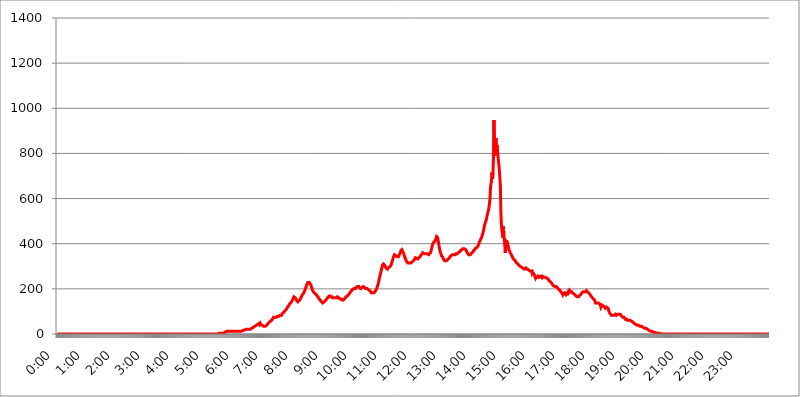
| Category | 2015.05.31. Intenzitás [W/m^2] |
|---|---|
| 0.0 | 0 |
| 0.0006944444444444445 | 0 |
| 0.001388888888888889 | 0 |
| 0.0020833333333333333 | 0 |
| 0.002777777777777778 | 0 |
| 0.003472222222222222 | 0 |
| 0.004166666666666667 | 0 |
| 0.004861111111111111 | 0 |
| 0.005555555555555556 | 0 |
| 0.0062499999999999995 | 0 |
| 0.006944444444444444 | 0 |
| 0.007638888888888889 | 0 |
| 0.008333333333333333 | 0 |
| 0.009027777777777779 | 0 |
| 0.009722222222222222 | 0 |
| 0.010416666666666666 | 0 |
| 0.011111111111111112 | 0 |
| 0.011805555555555555 | 0 |
| 0.012499999999999999 | 0 |
| 0.013194444444444444 | 0 |
| 0.013888888888888888 | 0 |
| 0.014583333333333332 | 0 |
| 0.015277777777777777 | 0 |
| 0.015972222222222224 | 0 |
| 0.016666666666666666 | 0 |
| 0.017361111111111112 | 0 |
| 0.018055555555555557 | 0 |
| 0.01875 | 0 |
| 0.019444444444444445 | 0 |
| 0.02013888888888889 | 0 |
| 0.020833333333333332 | 0 |
| 0.02152777777777778 | 0 |
| 0.022222222222222223 | 0 |
| 0.02291666666666667 | 0 |
| 0.02361111111111111 | 0 |
| 0.024305555555555556 | 0 |
| 0.024999999999999998 | 0 |
| 0.025694444444444447 | 0 |
| 0.02638888888888889 | 0 |
| 0.027083333333333334 | 0 |
| 0.027777777777777776 | 0 |
| 0.02847222222222222 | 0 |
| 0.029166666666666664 | 0 |
| 0.029861111111111113 | 0 |
| 0.030555555555555555 | 0 |
| 0.03125 | 0 |
| 0.03194444444444445 | 0 |
| 0.03263888888888889 | 0 |
| 0.03333333333333333 | 0 |
| 0.034027777777777775 | 0 |
| 0.034722222222222224 | 0 |
| 0.035416666666666666 | 0 |
| 0.036111111111111115 | 0 |
| 0.03680555555555556 | 0 |
| 0.0375 | 0 |
| 0.03819444444444444 | 0 |
| 0.03888888888888889 | 0 |
| 0.03958333333333333 | 0 |
| 0.04027777777777778 | 0 |
| 0.04097222222222222 | 0 |
| 0.041666666666666664 | 0 |
| 0.042361111111111106 | 0 |
| 0.04305555555555556 | 0 |
| 0.043750000000000004 | 0 |
| 0.044444444444444446 | 0 |
| 0.04513888888888889 | 0 |
| 0.04583333333333334 | 0 |
| 0.04652777777777778 | 0 |
| 0.04722222222222222 | 0 |
| 0.04791666666666666 | 0 |
| 0.04861111111111111 | 0 |
| 0.049305555555555554 | 0 |
| 0.049999999999999996 | 0 |
| 0.05069444444444445 | 0 |
| 0.051388888888888894 | 0 |
| 0.052083333333333336 | 0 |
| 0.05277777777777778 | 0 |
| 0.05347222222222222 | 0 |
| 0.05416666666666667 | 0 |
| 0.05486111111111111 | 0 |
| 0.05555555555555555 | 0 |
| 0.05625 | 0 |
| 0.05694444444444444 | 0 |
| 0.057638888888888885 | 0 |
| 0.05833333333333333 | 0 |
| 0.05902777777777778 | 0 |
| 0.059722222222222225 | 0 |
| 0.06041666666666667 | 0 |
| 0.061111111111111116 | 0 |
| 0.06180555555555556 | 0 |
| 0.0625 | 0 |
| 0.06319444444444444 | 0 |
| 0.06388888888888888 | 0 |
| 0.06458333333333334 | 0 |
| 0.06527777777777778 | 0 |
| 0.06597222222222222 | 0 |
| 0.06666666666666667 | 0 |
| 0.06736111111111111 | 0 |
| 0.06805555555555555 | 0 |
| 0.06874999999999999 | 0 |
| 0.06944444444444443 | 0 |
| 0.07013888888888889 | 0 |
| 0.07083333333333333 | 0 |
| 0.07152777777777779 | 0 |
| 0.07222222222222223 | 0 |
| 0.07291666666666667 | 0 |
| 0.07361111111111111 | 0 |
| 0.07430555555555556 | 0 |
| 0.075 | 0 |
| 0.07569444444444444 | 0 |
| 0.0763888888888889 | 0 |
| 0.07708333333333334 | 0 |
| 0.07777777777777778 | 0 |
| 0.07847222222222222 | 0 |
| 0.07916666666666666 | 0 |
| 0.0798611111111111 | 0 |
| 0.08055555555555556 | 0 |
| 0.08125 | 0 |
| 0.08194444444444444 | 0 |
| 0.08263888888888889 | 0 |
| 0.08333333333333333 | 0 |
| 0.08402777777777777 | 0 |
| 0.08472222222222221 | 0 |
| 0.08541666666666665 | 0 |
| 0.08611111111111112 | 0 |
| 0.08680555555555557 | 0 |
| 0.08750000000000001 | 0 |
| 0.08819444444444445 | 0 |
| 0.08888888888888889 | 0 |
| 0.08958333333333333 | 0 |
| 0.09027777777777778 | 0 |
| 0.09097222222222222 | 0 |
| 0.09166666666666667 | 0 |
| 0.09236111111111112 | 0 |
| 0.09305555555555556 | 0 |
| 0.09375 | 0 |
| 0.09444444444444444 | 0 |
| 0.09513888888888888 | 0 |
| 0.09583333333333333 | 0 |
| 0.09652777777777777 | 0 |
| 0.09722222222222222 | 0 |
| 0.09791666666666667 | 0 |
| 0.09861111111111111 | 0 |
| 0.09930555555555555 | 0 |
| 0.09999999999999999 | 0 |
| 0.10069444444444443 | 0 |
| 0.1013888888888889 | 0 |
| 0.10208333333333335 | 0 |
| 0.10277777777777779 | 0 |
| 0.10347222222222223 | 0 |
| 0.10416666666666667 | 0 |
| 0.10486111111111111 | 0 |
| 0.10555555555555556 | 0 |
| 0.10625 | 0 |
| 0.10694444444444444 | 0 |
| 0.1076388888888889 | 0 |
| 0.10833333333333334 | 0 |
| 0.10902777777777778 | 0 |
| 0.10972222222222222 | 0 |
| 0.1111111111111111 | 0 |
| 0.11180555555555556 | 0 |
| 0.11180555555555556 | 0 |
| 0.1125 | 0 |
| 0.11319444444444444 | 0 |
| 0.11388888888888889 | 0 |
| 0.11458333333333333 | 0 |
| 0.11527777777777777 | 0 |
| 0.11597222222222221 | 0 |
| 0.11666666666666665 | 0 |
| 0.1173611111111111 | 0 |
| 0.11805555555555557 | 0 |
| 0.11944444444444445 | 0 |
| 0.12013888888888889 | 0 |
| 0.12083333333333333 | 0 |
| 0.12152777777777778 | 0 |
| 0.12222222222222223 | 0 |
| 0.12291666666666667 | 0 |
| 0.12291666666666667 | 0 |
| 0.12361111111111112 | 0 |
| 0.12430555555555556 | 0 |
| 0.125 | 0 |
| 0.12569444444444444 | 0 |
| 0.12638888888888888 | 0 |
| 0.12708333333333333 | 0 |
| 0.16875 | 0 |
| 0.12847222222222224 | 0 |
| 0.12916666666666668 | 0 |
| 0.12986111111111112 | 0 |
| 0.13055555555555556 | 0 |
| 0.13125 | 0 |
| 0.13194444444444445 | 0 |
| 0.1326388888888889 | 0 |
| 0.13333333333333333 | 0 |
| 0.13402777777777777 | 0 |
| 0.13402777777777777 | 0 |
| 0.13472222222222222 | 0 |
| 0.13541666666666666 | 0 |
| 0.1361111111111111 | 0 |
| 0.13749999999999998 | 0 |
| 0.13819444444444443 | 0 |
| 0.1388888888888889 | 0 |
| 0.13958333333333334 | 0 |
| 0.14027777777777778 | 0 |
| 0.14097222222222222 | 0 |
| 0.14166666666666666 | 0 |
| 0.1423611111111111 | 0 |
| 0.14305555555555557 | 0 |
| 0.14375000000000002 | 0 |
| 0.14444444444444446 | 0 |
| 0.1451388888888889 | 0 |
| 0.1451388888888889 | 0 |
| 0.14652777777777778 | 0 |
| 0.14722222222222223 | 0 |
| 0.14791666666666667 | 0 |
| 0.1486111111111111 | 0 |
| 0.14930555555555555 | 0 |
| 0.15 | 0 |
| 0.15069444444444444 | 0 |
| 0.15138888888888888 | 0 |
| 0.15208333333333332 | 0 |
| 0.15277777777777776 | 0 |
| 0.15347222222222223 | 0 |
| 0.15416666666666667 | 0 |
| 0.15486111111111112 | 0 |
| 0.15555555555555556 | 0 |
| 0.15625 | 0 |
| 0.15694444444444444 | 0 |
| 0.15763888888888888 | 0 |
| 0.15833333333333333 | 0 |
| 0.15902777777777777 | 0 |
| 0.15972222222222224 | 0 |
| 0.16041666666666668 | 0 |
| 0.16111111111111112 | 0 |
| 0.16180555555555556 | 0 |
| 0.1625 | 0 |
| 0.16319444444444445 | 0 |
| 0.1638888888888889 | 0 |
| 0.16458333333333333 | 0 |
| 0.16527777777777777 | 0 |
| 0.16597222222222222 | 0 |
| 0.16666666666666666 | 0 |
| 0.1673611111111111 | 0 |
| 0.16805555555555554 | 0 |
| 0.16874999999999998 | 0 |
| 0.16944444444444443 | 0 |
| 0.17013888888888887 | 0 |
| 0.1708333333333333 | 0 |
| 0.17152777777777775 | 0 |
| 0.17222222222222225 | 0 |
| 0.1729166666666667 | 0 |
| 0.17361111111111113 | 0 |
| 0.17430555555555557 | 0 |
| 0.17500000000000002 | 0 |
| 0.17569444444444446 | 0 |
| 0.1763888888888889 | 0 |
| 0.17708333333333334 | 0 |
| 0.17777777777777778 | 0 |
| 0.17847222222222223 | 0 |
| 0.17916666666666667 | 0 |
| 0.1798611111111111 | 0 |
| 0.18055555555555555 | 0 |
| 0.18125 | 0 |
| 0.18194444444444444 | 0 |
| 0.1826388888888889 | 0 |
| 0.18333333333333335 | 0 |
| 0.1840277777777778 | 0 |
| 0.18472222222222223 | 0 |
| 0.18541666666666667 | 0 |
| 0.18611111111111112 | 0 |
| 0.18680555555555556 | 0 |
| 0.1875 | 0 |
| 0.18819444444444444 | 0 |
| 0.18888888888888888 | 0 |
| 0.18958333333333333 | 0 |
| 0.19027777777777777 | 0 |
| 0.1909722222222222 | 0 |
| 0.19166666666666665 | 0 |
| 0.19236111111111112 | 0 |
| 0.19305555555555554 | 0 |
| 0.19375 | 0 |
| 0.19444444444444445 | 0 |
| 0.1951388888888889 | 0 |
| 0.19583333333333333 | 0 |
| 0.19652777777777777 | 0 |
| 0.19722222222222222 | 0 |
| 0.19791666666666666 | 0 |
| 0.1986111111111111 | 0 |
| 0.19930555555555554 | 0 |
| 0.19999999999999998 | 0 |
| 0.20069444444444443 | 0 |
| 0.20138888888888887 | 0 |
| 0.2020833333333333 | 0 |
| 0.2027777777777778 | 0 |
| 0.2034722222222222 | 0 |
| 0.2041666666666667 | 0 |
| 0.20486111111111113 | 0 |
| 0.20555555555555557 | 0 |
| 0.20625000000000002 | 0 |
| 0.20694444444444446 | 0 |
| 0.2076388888888889 | 0 |
| 0.20833333333333334 | 0 |
| 0.20902777777777778 | 0 |
| 0.20972222222222223 | 0 |
| 0.21041666666666667 | 0 |
| 0.2111111111111111 | 0 |
| 0.21180555555555555 | 0 |
| 0.2125 | 0 |
| 0.21319444444444444 | 0 |
| 0.2138888888888889 | 0 |
| 0.21458333333333335 | 0 |
| 0.2152777777777778 | 0 |
| 0.21597222222222223 | 0 |
| 0.21666666666666667 | 0 |
| 0.21736111111111112 | 0 |
| 0.21805555555555556 | 0 |
| 0.21875 | 0 |
| 0.21944444444444444 | 0 |
| 0.22013888888888888 | 0 |
| 0.22083333333333333 | 0 |
| 0.22152777777777777 | 0 |
| 0.2222222222222222 | 0 |
| 0.22291666666666665 | 0 |
| 0.2236111111111111 | 0 |
| 0.22430555555555556 | 0 |
| 0.225 | 0 |
| 0.22569444444444445 | 3.525 |
| 0.2263888888888889 | 3.525 |
| 0.22708333333333333 | 3.525 |
| 0.22777777777777777 | 3.525 |
| 0.22847222222222222 | 3.525 |
| 0.22916666666666666 | 3.525 |
| 0.2298611111111111 | 3.525 |
| 0.23055555555555554 | 3.525 |
| 0.23124999999999998 | 3.525 |
| 0.23194444444444443 | 3.525 |
| 0.23263888888888887 | 3.525 |
| 0.2333333333333333 | 3.525 |
| 0.2340277777777778 | 3.525 |
| 0.2347222222222222 | 7.887 |
| 0.2354166666666667 | 7.887 |
| 0.23611111111111113 | 7.887 |
| 0.23680555555555557 | 7.887 |
| 0.23750000000000002 | 12.257 |
| 0.23819444444444446 | 12.257 |
| 0.2388888888888889 | 7.887 |
| 0.23958333333333334 | 12.257 |
| 0.24027777777777778 | 12.257 |
| 0.24097222222222223 | 12.257 |
| 0.24166666666666667 | 12.257 |
| 0.2423611111111111 | 12.257 |
| 0.24305555555555555 | 12.257 |
| 0.24375 | 12.257 |
| 0.24444444444444446 | 12.257 |
| 0.24513888888888888 | 12.257 |
| 0.24583333333333335 | 12.257 |
| 0.2465277777777778 | 12.257 |
| 0.24722222222222223 | 12.257 |
| 0.24791666666666667 | 12.257 |
| 0.24861111111111112 | 12.257 |
| 0.24930555555555556 | 12.257 |
| 0.25 | 12.257 |
| 0.25069444444444444 | 12.257 |
| 0.2513888888888889 | 12.257 |
| 0.2520833333333333 | 12.257 |
| 0.25277777777777777 | 12.257 |
| 0.2534722222222222 | 12.257 |
| 0.25416666666666665 | 12.257 |
| 0.2548611111111111 | 12.257 |
| 0.2555555555555556 | 12.257 |
| 0.25625000000000003 | 12.257 |
| 0.2569444444444445 | 12.257 |
| 0.2576388888888889 | 12.257 |
| 0.25833333333333336 | 12.257 |
| 0.2590277777777778 | 12.257 |
| 0.25972222222222224 | 16.636 |
| 0.2604166666666667 | 16.636 |
| 0.2611111111111111 | 16.636 |
| 0.26180555555555557 | 16.636 |
| 0.2625 | 16.636 |
| 0.26319444444444445 | 21.024 |
| 0.2638888888888889 | 21.024 |
| 0.26458333333333334 | 21.024 |
| 0.2652777777777778 | 21.024 |
| 0.2659722222222222 | 21.024 |
| 0.26666666666666666 | 21.024 |
| 0.2673611111111111 | 21.024 |
| 0.26805555555555555 | 21.024 |
| 0.26875 | 21.024 |
| 0.26944444444444443 | 21.024 |
| 0.2701388888888889 | 21.024 |
| 0.2708333333333333 | 21.024 |
| 0.27152777777777776 | 25.419 |
| 0.2722222222222222 | 25.419 |
| 0.27291666666666664 | 25.419 |
| 0.2736111111111111 | 25.419 |
| 0.2743055555555555 | 29.823 |
| 0.27499999999999997 | 29.823 |
| 0.27569444444444446 | 29.823 |
| 0.27638888888888885 | 29.823 |
| 0.27708333333333335 | 34.234 |
| 0.2777777777777778 | 34.234 |
| 0.27847222222222223 | 38.653 |
| 0.2791666666666667 | 38.653 |
| 0.2798611111111111 | 38.653 |
| 0.28055555555555556 | 43.079 |
| 0.28125 | 43.079 |
| 0.28194444444444444 | 43.079 |
| 0.2826388888888889 | 43.079 |
| 0.2833333333333333 | 47.511 |
| 0.28402777777777777 | 43.079 |
| 0.2847222222222222 | 47.511 |
| 0.28541666666666665 | 43.079 |
| 0.28611111111111115 | 43.079 |
| 0.28680555555555554 | 43.079 |
| 0.28750000000000003 | 38.653 |
| 0.2881944444444445 | 38.653 |
| 0.2888888888888889 | 38.653 |
| 0.28958333333333336 | 34.234 |
| 0.2902777777777778 | 34.234 |
| 0.29097222222222224 | 34.234 |
| 0.2916666666666667 | 34.234 |
| 0.2923611111111111 | 34.234 |
| 0.29305555555555557 | 34.234 |
| 0.29375 | 38.653 |
| 0.29444444444444445 | 38.653 |
| 0.2951388888888889 | 43.079 |
| 0.29583333333333334 | 47.511 |
| 0.2965277777777778 | 47.511 |
| 0.2972222222222222 | 51.951 |
| 0.29791666666666666 | 51.951 |
| 0.2986111111111111 | 56.398 |
| 0.29930555555555555 | 56.398 |
| 0.3 | 56.398 |
| 0.30069444444444443 | 60.85 |
| 0.3013888888888889 | 65.31 |
| 0.3020833333333333 | 65.31 |
| 0.30277777777777776 | 69.775 |
| 0.3034722222222222 | 74.246 |
| 0.30416666666666664 | 74.246 |
| 0.3048611111111111 | 74.246 |
| 0.3055555555555555 | 74.246 |
| 0.30624999999999997 | 74.246 |
| 0.3069444444444444 | 74.246 |
| 0.3076388888888889 | 74.246 |
| 0.30833333333333335 | 74.246 |
| 0.3090277777777778 | 78.722 |
| 0.30972222222222223 | 78.722 |
| 0.3104166666666667 | 78.722 |
| 0.3111111111111111 | 78.722 |
| 0.31180555555555556 | 78.722 |
| 0.3125 | 83.205 |
| 0.31319444444444444 | 83.205 |
| 0.3138888888888889 | 83.205 |
| 0.3145833333333333 | 83.205 |
| 0.31527777777777777 | 87.692 |
| 0.3159722222222222 | 92.184 |
| 0.31666666666666665 | 92.184 |
| 0.31736111111111115 | 92.184 |
| 0.31805555555555554 | 96.682 |
| 0.31875000000000003 | 101.184 |
| 0.3194444444444445 | 101.184 |
| 0.3201388888888889 | 105.69 |
| 0.32083333333333336 | 105.69 |
| 0.3215277777777778 | 110.201 |
| 0.32222222222222224 | 114.716 |
| 0.3229166666666667 | 119.235 |
| 0.3236111111111111 | 119.235 |
| 0.32430555555555557 | 123.758 |
| 0.325 | 128.284 |
| 0.32569444444444445 | 132.814 |
| 0.3263888888888889 | 132.814 |
| 0.32708333333333334 | 137.347 |
| 0.3277777777777778 | 137.347 |
| 0.3284722222222222 | 141.884 |
| 0.32916666666666666 | 146.423 |
| 0.3298611111111111 | 150.964 |
| 0.33055555555555555 | 155.509 |
| 0.33125 | 160.056 |
| 0.33194444444444443 | 164.605 |
| 0.3326388888888889 | 164.605 |
| 0.3333333333333333 | 164.605 |
| 0.3340277777777778 | 160.056 |
| 0.3347222222222222 | 155.509 |
| 0.3354166666666667 | 150.964 |
| 0.3361111111111111 | 146.423 |
| 0.3368055555555556 | 146.423 |
| 0.33749999999999997 | 141.884 |
| 0.33819444444444446 | 141.884 |
| 0.33888888888888885 | 146.423 |
| 0.33958333333333335 | 146.423 |
| 0.34027777777777773 | 150.964 |
| 0.34097222222222223 | 155.509 |
| 0.3416666666666666 | 160.056 |
| 0.3423611111111111 | 164.605 |
| 0.3430555555555555 | 169.156 |
| 0.34375 | 173.709 |
| 0.3444444444444445 | 173.709 |
| 0.3451388888888889 | 178.264 |
| 0.3458333333333334 | 182.82 |
| 0.34652777777777777 | 187.378 |
| 0.34722222222222227 | 191.937 |
| 0.34791666666666665 | 201.058 |
| 0.34861111111111115 | 205.62 |
| 0.34930555555555554 | 210.182 |
| 0.35000000000000003 | 219.309 |
| 0.3506944444444444 | 223.873 |
| 0.3513888888888889 | 228.436 |
| 0.3520833333333333 | 228.436 |
| 0.3527777777777778 | 228.436 |
| 0.3534722222222222 | 228.436 |
| 0.3541666666666667 | 223.873 |
| 0.3548611111111111 | 223.873 |
| 0.35555555555555557 | 219.309 |
| 0.35625 | 210.182 |
| 0.35694444444444445 | 205.62 |
| 0.3576388888888889 | 196.497 |
| 0.35833333333333334 | 191.937 |
| 0.3590277777777778 | 187.378 |
| 0.3597222222222222 | 187.378 |
| 0.36041666666666666 | 182.82 |
| 0.3611111111111111 | 182.82 |
| 0.36180555555555555 | 178.264 |
| 0.3625 | 178.264 |
| 0.36319444444444443 | 173.709 |
| 0.3638888888888889 | 173.709 |
| 0.3645833333333333 | 169.156 |
| 0.3652777777777778 | 164.605 |
| 0.3659722222222222 | 164.605 |
| 0.3666666666666667 | 160.056 |
| 0.3673611111111111 | 155.509 |
| 0.3680555555555556 | 155.509 |
| 0.36874999999999997 | 150.964 |
| 0.36944444444444446 | 146.423 |
| 0.37013888888888885 | 146.423 |
| 0.37083333333333335 | 141.884 |
| 0.37152777777777773 | 141.884 |
| 0.37222222222222223 | 137.347 |
| 0.3729166666666666 | 137.347 |
| 0.3736111111111111 | 137.347 |
| 0.3743055555555555 | 141.884 |
| 0.375 | 141.884 |
| 0.3756944444444445 | 146.423 |
| 0.3763888888888889 | 146.423 |
| 0.3770833333333334 | 150.964 |
| 0.37777777777777777 | 155.509 |
| 0.37847222222222227 | 155.509 |
| 0.37916666666666665 | 160.056 |
| 0.37986111111111115 | 164.605 |
| 0.38055555555555554 | 164.605 |
| 0.38125000000000003 | 164.605 |
| 0.3819444444444444 | 169.156 |
| 0.3826388888888889 | 169.156 |
| 0.3833333333333333 | 164.605 |
| 0.3840277777777778 | 164.605 |
| 0.3847222222222222 | 164.605 |
| 0.3854166666666667 | 164.605 |
| 0.3861111111111111 | 160.056 |
| 0.38680555555555557 | 160.056 |
| 0.3875 | 160.056 |
| 0.38819444444444445 | 160.056 |
| 0.3888888888888889 | 160.056 |
| 0.38958333333333334 | 160.056 |
| 0.3902777777777778 | 160.056 |
| 0.3909722222222222 | 160.056 |
| 0.39166666666666666 | 160.056 |
| 0.3923611111111111 | 160.056 |
| 0.39305555555555555 | 164.605 |
| 0.39375 | 164.605 |
| 0.39444444444444443 | 164.605 |
| 0.3951388888888889 | 160.056 |
| 0.3958333333333333 | 160.056 |
| 0.3965277777777778 | 155.509 |
| 0.3972222222222222 | 155.509 |
| 0.3979166666666667 | 155.509 |
| 0.3986111111111111 | 155.509 |
| 0.3993055555555556 | 150.964 |
| 0.39999999999999997 | 150.964 |
| 0.40069444444444446 | 150.964 |
| 0.40138888888888885 | 150.964 |
| 0.40208333333333335 | 150.964 |
| 0.40277777777777773 | 155.509 |
| 0.40347222222222223 | 155.509 |
| 0.4041666666666666 | 160.056 |
| 0.4048611111111111 | 164.605 |
| 0.4055555555555555 | 164.605 |
| 0.40625 | 164.605 |
| 0.4069444444444445 | 169.156 |
| 0.4076388888888889 | 169.156 |
| 0.4083333333333334 | 173.709 |
| 0.40902777777777777 | 173.709 |
| 0.40972222222222227 | 178.264 |
| 0.41041666666666665 | 182.82 |
| 0.41111111111111115 | 182.82 |
| 0.41180555555555554 | 187.378 |
| 0.41250000000000003 | 191.937 |
| 0.4131944444444444 | 191.937 |
| 0.4138888888888889 | 196.497 |
| 0.4145833333333333 | 196.497 |
| 0.4152777777777778 | 196.497 |
| 0.4159722222222222 | 201.058 |
| 0.4166666666666667 | 201.058 |
| 0.4173611111111111 | 201.058 |
| 0.41805555555555557 | 201.058 |
| 0.41875 | 205.62 |
| 0.41944444444444445 | 205.62 |
| 0.4201388888888889 | 205.62 |
| 0.42083333333333334 | 210.182 |
| 0.4215277777777778 | 210.182 |
| 0.4222222222222222 | 210.182 |
| 0.42291666666666666 | 210.182 |
| 0.4236111111111111 | 205.62 |
| 0.42430555555555555 | 205.62 |
| 0.425 | 205.62 |
| 0.42569444444444443 | 201.058 |
| 0.4263888888888889 | 201.058 |
| 0.4270833333333333 | 205.62 |
| 0.4277777777777778 | 205.62 |
| 0.4284722222222222 | 205.62 |
| 0.4291666666666667 | 210.182 |
| 0.4298611111111111 | 210.182 |
| 0.4305555555555556 | 210.182 |
| 0.43124999999999997 | 205.62 |
| 0.43194444444444446 | 205.62 |
| 0.43263888888888885 | 201.058 |
| 0.43333333333333335 | 201.058 |
| 0.43402777777777773 | 201.058 |
| 0.43472222222222223 | 201.058 |
| 0.4354166666666666 | 201.058 |
| 0.4361111111111111 | 201.058 |
| 0.4368055555555555 | 196.497 |
| 0.4375 | 196.497 |
| 0.4381944444444445 | 191.937 |
| 0.4388888888888889 | 191.937 |
| 0.4395833333333334 | 187.378 |
| 0.44027777777777777 | 182.82 |
| 0.44097222222222227 | 182.82 |
| 0.44166666666666665 | 182.82 |
| 0.44236111111111115 | 182.82 |
| 0.44305555555555554 | 182.82 |
| 0.44375000000000003 | 182.82 |
| 0.4444444444444444 | 182.82 |
| 0.4451388888888889 | 182.82 |
| 0.4458333333333333 | 187.378 |
| 0.4465277777777778 | 191.937 |
| 0.4472222222222222 | 191.937 |
| 0.4479166666666667 | 201.058 |
| 0.4486111111111111 | 205.62 |
| 0.44930555555555557 | 214.746 |
| 0.45 | 219.309 |
| 0.45069444444444445 | 228.436 |
| 0.4513888888888889 | 242.127 |
| 0.45208333333333334 | 251.251 |
| 0.4527777777777778 | 260.373 |
| 0.4534722222222222 | 269.49 |
| 0.45416666666666666 | 278.603 |
| 0.4548611111111111 | 287.709 |
| 0.45555555555555555 | 296.808 |
| 0.45625 | 305.898 |
| 0.45694444444444443 | 305.898 |
| 0.4576388888888889 | 310.44 |
| 0.4583333333333333 | 310.44 |
| 0.4590277777777778 | 305.898 |
| 0.4597222222222222 | 301.354 |
| 0.4604166666666667 | 296.808 |
| 0.4611111111111111 | 292.259 |
| 0.4618055555555556 | 292.259 |
| 0.46249999999999997 | 292.259 |
| 0.46319444444444446 | 287.709 |
| 0.46388888888888885 | 292.259 |
| 0.46458333333333335 | 292.259 |
| 0.46527777777777773 | 292.259 |
| 0.46597222222222223 | 296.808 |
| 0.4666666666666666 | 296.808 |
| 0.4673611111111111 | 301.354 |
| 0.4680555555555555 | 305.898 |
| 0.46875 | 310.44 |
| 0.4694444444444445 | 319.517 |
| 0.4701388888888889 | 324.052 |
| 0.4708333333333334 | 333.113 |
| 0.47152777777777777 | 342.162 |
| 0.47222222222222227 | 346.682 |
| 0.47291666666666665 | 351.198 |
| 0.47361111111111115 | 351.198 |
| 0.47430555555555554 | 351.198 |
| 0.47500000000000003 | 346.682 |
| 0.4756944444444444 | 346.682 |
| 0.4763888888888889 | 342.162 |
| 0.4770833333333333 | 342.162 |
| 0.4777777777777778 | 342.162 |
| 0.4784722222222222 | 342.162 |
| 0.4791666666666667 | 346.682 |
| 0.4798611111111111 | 351.198 |
| 0.48055555555555557 | 355.712 |
| 0.48125 | 360.221 |
| 0.48194444444444445 | 369.23 |
| 0.4826388888888889 | 369.23 |
| 0.48333333333333334 | 373.729 |
| 0.4840277777777778 | 369.23 |
| 0.4847222222222222 | 364.728 |
| 0.48541666666666666 | 360.221 |
| 0.4861111111111111 | 355.712 |
| 0.48680555555555555 | 346.682 |
| 0.4875 | 342.162 |
| 0.48819444444444443 | 333.113 |
| 0.4888888888888889 | 328.584 |
| 0.4895833333333333 | 324.052 |
| 0.4902777777777778 | 319.517 |
| 0.4909722222222222 | 319.517 |
| 0.4916666666666667 | 314.98 |
| 0.4923611111111111 | 314.98 |
| 0.4930555555555556 | 314.98 |
| 0.49374999999999997 | 314.98 |
| 0.49444444444444446 | 314.98 |
| 0.49513888888888885 | 314.98 |
| 0.49583333333333335 | 314.98 |
| 0.49652777777777773 | 314.98 |
| 0.49722222222222223 | 314.98 |
| 0.4979166666666666 | 319.517 |
| 0.4986111111111111 | 319.517 |
| 0.4993055555555555 | 324.052 |
| 0.5 | 324.052 |
| 0.5006944444444444 | 328.584 |
| 0.5013888888888889 | 333.113 |
| 0.5020833333333333 | 337.639 |
| 0.5027777777777778 | 337.639 |
| 0.5034722222222222 | 337.639 |
| 0.5041666666666667 | 333.113 |
| 0.5048611111111111 | 333.113 |
| 0.5055555555555555 | 333.113 |
| 0.50625 | 333.113 |
| 0.5069444444444444 | 337.639 |
| 0.5076388888888889 | 337.639 |
| 0.5083333333333333 | 342.162 |
| 0.5090277777777777 | 342.162 |
| 0.5097222222222222 | 346.682 |
| 0.5104166666666666 | 351.198 |
| 0.5111111111111112 | 351.198 |
| 0.5118055555555555 | 355.712 |
| 0.5125000000000001 | 360.221 |
| 0.5131944444444444 | 360.221 |
| 0.513888888888889 | 360.221 |
| 0.5145833333333333 | 355.712 |
| 0.5152777777777778 | 355.712 |
| 0.5159722222222222 | 355.712 |
| 0.5166666666666667 | 355.712 |
| 0.517361111111111 | 355.712 |
| 0.5180555555555556 | 355.712 |
| 0.5187499999999999 | 355.712 |
| 0.5194444444444445 | 355.712 |
| 0.5201388888888888 | 355.712 |
| 0.5208333333333334 | 351.198 |
| 0.5215277777777778 | 351.198 |
| 0.5222222222222223 | 355.712 |
| 0.5229166666666667 | 355.712 |
| 0.5236111111111111 | 360.221 |
| 0.5243055555555556 | 369.23 |
| 0.525 | 378.224 |
| 0.5256944444444445 | 387.202 |
| 0.5263888888888889 | 396.164 |
| 0.5270833333333333 | 400.638 |
| 0.5277777777777778 | 405.108 |
| 0.5284722222222222 | 405.108 |
| 0.5291666666666667 | 409.574 |
| 0.5298611111111111 | 414.035 |
| 0.5305555555555556 | 418.492 |
| 0.53125 | 422.943 |
| 0.5319444444444444 | 431.833 |
| 0.5326388888888889 | 431.833 |
| 0.5333333333333333 | 427.39 |
| 0.5340277777777778 | 418.492 |
| 0.5347222222222222 | 405.108 |
| 0.5354166666666667 | 391.685 |
| 0.5361111111111111 | 378.224 |
| 0.5368055555555555 | 369.23 |
| 0.5375 | 360.221 |
| 0.5381944444444444 | 355.712 |
| 0.5388888888888889 | 346.682 |
| 0.5395833333333333 | 346.682 |
| 0.5402777777777777 | 342.162 |
| 0.5409722222222222 | 337.639 |
| 0.5416666666666666 | 333.113 |
| 0.5423611111111112 | 328.584 |
| 0.5430555555555555 | 328.584 |
| 0.5437500000000001 | 324.052 |
| 0.5444444444444444 | 324.052 |
| 0.545138888888889 | 324.052 |
| 0.5458333333333333 | 324.052 |
| 0.5465277777777778 | 324.052 |
| 0.5472222222222222 | 328.584 |
| 0.5479166666666667 | 328.584 |
| 0.548611111111111 | 333.113 |
| 0.5493055555555556 | 333.113 |
| 0.5499999999999999 | 337.639 |
| 0.5506944444444445 | 342.162 |
| 0.5513888888888888 | 342.162 |
| 0.5520833333333334 | 346.682 |
| 0.5527777777777778 | 346.682 |
| 0.5534722222222223 | 346.682 |
| 0.5541666666666667 | 351.198 |
| 0.5548611111111111 | 351.198 |
| 0.5555555555555556 | 351.198 |
| 0.55625 | 351.198 |
| 0.5569444444444445 | 351.198 |
| 0.5576388888888889 | 351.198 |
| 0.5583333333333333 | 351.198 |
| 0.5590277777777778 | 355.712 |
| 0.5597222222222222 | 355.712 |
| 0.5604166666666667 | 355.712 |
| 0.5611111111111111 | 355.712 |
| 0.5618055555555556 | 355.712 |
| 0.5625 | 360.221 |
| 0.5631944444444444 | 360.221 |
| 0.5638888888888889 | 360.221 |
| 0.5645833333333333 | 364.728 |
| 0.5652777777777778 | 369.23 |
| 0.5659722222222222 | 369.23 |
| 0.5666666666666667 | 369.23 |
| 0.5673611111111111 | 373.729 |
| 0.5680555555555555 | 373.729 |
| 0.56875 | 378.224 |
| 0.5694444444444444 | 378.224 |
| 0.5701388888888889 | 378.224 |
| 0.5708333333333333 | 378.224 |
| 0.5715277777777777 | 378.224 |
| 0.5722222222222222 | 378.224 |
| 0.5729166666666666 | 373.729 |
| 0.5736111111111112 | 369.23 |
| 0.5743055555555555 | 364.728 |
| 0.5750000000000001 | 360.221 |
| 0.5756944444444444 | 360.221 |
| 0.576388888888889 | 355.712 |
| 0.5770833333333333 | 351.198 |
| 0.5777777777777778 | 351.198 |
| 0.5784722222222222 | 351.198 |
| 0.5791666666666667 | 351.198 |
| 0.579861111111111 | 351.198 |
| 0.5805555555555556 | 355.712 |
| 0.5812499999999999 | 355.712 |
| 0.5819444444444445 | 360.221 |
| 0.5826388888888888 | 360.221 |
| 0.5833333333333334 | 364.728 |
| 0.5840277777777778 | 369.23 |
| 0.5847222222222223 | 369.23 |
| 0.5854166666666667 | 373.729 |
| 0.5861111111111111 | 378.224 |
| 0.5868055555555556 | 378.224 |
| 0.5875 | 378.224 |
| 0.5881944444444445 | 382.715 |
| 0.5888888888888889 | 382.715 |
| 0.5895833333333333 | 387.202 |
| 0.5902777777777778 | 391.685 |
| 0.5909722222222222 | 396.164 |
| 0.5916666666666667 | 405.108 |
| 0.5923611111111111 | 409.574 |
| 0.5930555555555556 | 414.035 |
| 0.59375 | 418.492 |
| 0.5944444444444444 | 422.943 |
| 0.5951388888888889 | 427.39 |
| 0.5958333333333333 | 436.27 |
| 0.5965277777777778 | 440.702 |
| 0.5972222222222222 | 449.551 |
| 0.5979166666666667 | 458.38 |
| 0.5986111111111111 | 471.582 |
| 0.5993055555555555 | 475.972 |
| 0.6 | 489.108 |
| 0.6006944444444444 | 493.475 |
| 0.6013888888888889 | 502.192 |
| 0.6020833333333333 | 510.885 |
| 0.6027777777777777 | 523.88 |
| 0.6034722222222222 | 532.513 |
| 0.6041666666666666 | 541.121 |
| 0.6048611111111112 | 549.704 |
| 0.6055555555555555 | 562.53 |
| 0.6062500000000001 | 579.542 |
| 0.6069444444444444 | 600.661 |
| 0.607638888888889 | 646.537 |
| 0.6083333333333333 | 667.123 |
| 0.6090277777777778 | 675.311 |
| 0.6097222222222222 | 715.858 |
| 0.6104166666666667 | 687.544 |
| 0.611111111111111 | 711.832 |
| 0.6118055555555556 | 779.42 |
| 0.6124999999999999 | 947.58 |
| 0.6131944444444445 | 806.757 |
| 0.6138888888888888 | 791.169 |
| 0.6145833333333334 | 814.519 |
| 0.6152777777777778 | 868.305 |
| 0.6159722222222223 | 806.757 |
| 0.6166666666666667 | 837.682 |
| 0.6173611111111111 | 814.519 |
| 0.6180555555555556 | 791.169 |
| 0.61875 | 767.62 |
| 0.6194444444444445 | 747.834 |
| 0.6201388888888889 | 723.889 |
| 0.6208333333333333 | 691.608 |
| 0.6215277777777778 | 654.791 |
| 0.6222222222222222 | 536.82 |
| 0.6229166666666667 | 484.735 |
| 0.6236111111111111 | 462.786 |
| 0.6243055555555556 | 467.187 |
| 0.625 | 427.39 |
| 0.6256944444444444 | 475.972 |
| 0.6263888888888889 | 436.27 |
| 0.6270833333333333 | 418.492 |
| 0.6277777777777778 | 422.943 |
| 0.6284722222222222 | 360.221 |
| 0.6291666666666667 | 378.224 |
| 0.6298611111111111 | 414.035 |
| 0.6305555555555555 | 414.035 |
| 0.63125 | 405.108 |
| 0.6319444444444444 | 396.164 |
| 0.6326388888888889 | 387.202 |
| 0.6333333333333333 | 378.224 |
| 0.6340277777777777 | 369.23 |
| 0.6347222222222222 | 364.728 |
| 0.6354166666666666 | 360.221 |
| 0.6361111111111112 | 355.712 |
| 0.6368055555555555 | 351.198 |
| 0.6375000000000001 | 346.682 |
| 0.6381944444444444 | 342.162 |
| 0.638888888888889 | 337.639 |
| 0.6395833333333333 | 333.113 |
| 0.6402777777777778 | 333.113 |
| 0.6409722222222222 | 328.584 |
| 0.6416666666666667 | 328.584 |
| 0.642361111111111 | 324.052 |
| 0.6430555555555556 | 319.517 |
| 0.6437499999999999 | 319.517 |
| 0.6444444444444445 | 314.98 |
| 0.6451388888888888 | 314.98 |
| 0.6458333333333334 | 310.44 |
| 0.6465277777777778 | 310.44 |
| 0.6472222222222223 | 305.898 |
| 0.6479166666666667 | 305.898 |
| 0.6486111111111111 | 301.354 |
| 0.6493055555555556 | 301.354 |
| 0.65 | 301.354 |
| 0.6506944444444445 | 296.808 |
| 0.6513888888888889 | 296.808 |
| 0.6520833333333333 | 296.808 |
| 0.6527777777777778 | 292.259 |
| 0.6534722222222222 | 292.259 |
| 0.6541666666666667 | 292.259 |
| 0.6548611111111111 | 287.709 |
| 0.6555555555555556 | 287.709 |
| 0.65625 | 287.709 |
| 0.6569444444444444 | 292.259 |
| 0.6576388888888889 | 287.709 |
| 0.6583333333333333 | 287.709 |
| 0.6590277777777778 | 287.709 |
| 0.6597222222222222 | 287.709 |
| 0.6604166666666667 | 287.709 |
| 0.6611111111111111 | 283.156 |
| 0.6618055555555555 | 283.156 |
| 0.6625 | 283.156 |
| 0.6631944444444444 | 278.603 |
| 0.6638888888888889 | 278.603 |
| 0.6645833333333333 | 278.603 |
| 0.6652777777777777 | 278.603 |
| 0.6659722222222222 | 269.49 |
| 0.6666666666666666 | 274.047 |
| 0.6673611111111111 | 269.49 |
| 0.6680555555555556 | 269.49 |
| 0.6687500000000001 | 264.932 |
| 0.6694444444444444 | 260.373 |
| 0.6701388888888888 | 251.251 |
| 0.6708333333333334 | 246.689 |
| 0.6715277777777778 | 251.251 |
| 0.6722222222222222 | 251.251 |
| 0.6729166666666666 | 251.251 |
| 0.6736111111111112 | 251.251 |
| 0.6743055555555556 | 255.813 |
| 0.6749999999999999 | 255.813 |
| 0.6756944444444444 | 251.251 |
| 0.6763888888888889 | 251.251 |
| 0.6770833333333334 | 255.813 |
| 0.6777777777777777 | 255.813 |
| 0.6784722222222223 | 255.813 |
| 0.6791666666666667 | 255.813 |
| 0.6798611111111111 | 251.251 |
| 0.6805555555555555 | 255.813 |
| 0.68125 | 255.813 |
| 0.6819444444444445 | 255.813 |
| 0.6826388888888889 | 251.251 |
| 0.6833333333333332 | 251.251 |
| 0.6840277777777778 | 251.251 |
| 0.6847222222222222 | 251.251 |
| 0.6854166666666667 | 251.251 |
| 0.686111111111111 | 251.251 |
| 0.6868055555555556 | 246.689 |
| 0.6875 | 246.689 |
| 0.6881944444444444 | 246.689 |
| 0.688888888888889 | 242.127 |
| 0.6895833333333333 | 237.564 |
| 0.6902777777777778 | 237.564 |
| 0.6909722222222222 | 233 |
| 0.6916666666666668 | 233 |
| 0.6923611111111111 | 228.436 |
| 0.6930555555555555 | 228.436 |
| 0.69375 | 223.873 |
| 0.6944444444444445 | 219.309 |
| 0.6951388888888889 | 219.309 |
| 0.6958333333333333 | 214.746 |
| 0.6965277777777777 | 214.746 |
| 0.6972222222222223 | 214.746 |
| 0.6979166666666666 | 210.182 |
| 0.6986111111111111 | 210.182 |
| 0.6993055555555556 | 210.182 |
| 0.7000000000000001 | 210.182 |
| 0.7006944444444444 | 210.182 |
| 0.7013888888888888 | 205.62 |
| 0.7020833333333334 | 201.058 |
| 0.7027777777777778 | 201.058 |
| 0.7034722222222222 | 201.058 |
| 0.7041666666666666 | 196.497 |
| 0.7048611111111112 | 196.497 |
| 0.7055555555555556 | 196.497 |
| 0.7062499999999999 | 187.378 |
| 0.7069444444444444 | 187.378 |
| 0.7076388888888889 | 182.82 |
| 0.7083333333333334 | 178.264 |
| 0.7090277777777777 | 173.709 |
| 0.7097222222222223 | 178.264 |
| 0.7104166666666667 | 178.264 |
| 0.7111111111111111 | 178.264 |
| 0.7118055555555555 | 182.82 |
| 0.7125 | 182.82 |
| 0.7131944444444445 | 178.264 |
| 0.7138888888888889 | 173.709 |
| 0.7145833333333332 | 173.709 |
| 0.7152777777777778 | 178.264 |
| 0.7159722222222222 | 182.82 |
| 0.7166666666666667 | 187.378 |
| 0.717361111111111 | 182.82 |
| 0.7180555555555556 | 187.378 |
| 0.71875 | 191.937 |
| 0.7194444444444444 | 187.378 |
| 0.720138888888889 | 187.378 |
| 0.7208333333333333 | 187.378 |
| 0.7215277777777778 | 187.378 |
| 0.7222222222222222 | 182.82 |
| 0.7229166666666668 | 182.82 |
| 0.7236111111111111 | 182.82 |
| 0.7243055555555555 | 178.264 |
| 0.725 | 178.264 |
| 0.7256944444444445 | 178.264 |
| 0.7263888888888889 | 173.709 |
| 0.7270833333333333 | 169.156 |
| 0.7277777777777777 | 169.156 |
| 0.7284722222222223 | 169.156 |
| 0.7291666666666666 | 164.605 |
| 0.7298611111111111 | 164.605 |
| 0.7305555555555556 | 164.605 |
| 0.7312500000000001 | 164.605 |
| 0.7319444444444444 | 169.156 |
| 0.7326388888888888 | 169.156 |
| 0.7333333333333334 | 169.156 |
| 0.7340277777777778 | 173.709 |
| 0.7347222222222222 | 178.264 |
| 0.7354166666666666 | 178.264 |
| 0.7361111111111112 | 182.82 |
| 0.7368055555555556 | 182.82 |
| 0.7374999999999999 | 187.378 |
| 0.7381944444444444 | 187.378 |
| 0.7388888888888889 | 187.378 |
| 0.7395833333333334 | 187.378 |
| 0.7402777777777777 | 187.378 |
| 0.7409722222222223 | 187.378 |
| 0.7416666666666667 | 187.378 |
| 0.7423611111111111 | 191.937 |
| 0.7430555555555555 | 191.937 |
| 0.74375 | 187.378 |
| 0.7444444444444445 | 187.378 |
| 0.7451388888888889 | 182.82 |
| 0.7458333333333332 | 182.82 |
| 0.7465277777777778 | 178.264 |
| 0.7472222222222222 | 173.709 |
| 0.7479166666666667 | 173.709 |
| 0.748611111111111 | 169.156 |
| 0.7493055555555556 | 164.605 |
| 0.75 | 164.605 |
| 0.7506944444444444 | 160.056 |
| 0.751388888888889 | 160.056 |
| 0.7520833333333333 | 155.509 |
| 0.7527777777777778 | 155.509 |
| 0.7534722222222222 | 150.964 |
| 0.7541666666666668 | 146.423 |
| 0.7548611111111111 | 137.347 |
| 0.7555555555555555 | 137.347 |
| 0.75625 | 137.347 |
| 0.7569444444444445 | 137.347 |
| 0.7576388888888889 | 137.347 |
| 0.7583333333333333 | 137.347 |
| 0.7590277777777777 | 137.347 |
| 0.7597222222222223 | 137.347 |
| 0.7604166666666666 | 132.814 |
| 0.7611111111111111 | 132.814 |
| 0.7618055555555556 | 128.284 |
| 0.7625000000000001 | 119.235 |
| 0.7631944444444444 | 119.235 |
| 0.7638888888888888 | 128.284 |
| 0.7645833333333334 | 128.284 |
| 0.7652777777777778 | 128.284 |
| 0.7659722222222222 | 123.758 |
| 0.7666666666666666 | 123.758 |
| 0.7673611111111112 | 123.758 |
| 0.7680555555555556 | 119.235 |
| 0.7687499999999999 | 114.716 |
| 0.7694444444444444 | 114.716 |
| 0.7701388888888889 | 119.235 |
| 0.7708333333333334 | 119.235 |
| 0.7715277777777777 | 119.235 |
| 0.7722222222222223 | 114.716 |
| 0.7729166666666667 | 110.201 |
| 0.7736111111111111 | 101.184 |
| 0.7743055555555555 | 96.682 |
| 0.775 | 92.184 |
| 0.7756944444444445 | 92.184 |
| 0.7763888888888889 | 87.692 |
| 0.7770833333333332 | 83.205 |
| 0.7777777777777778 | 83.205 |
| 0.7784722222222222 | 83.205 |
| 0.7791666666666667 | 83.205 |
| 0.779861111111111 | 83.205 |
| 0.7805555555555556 | 83.205 |
| 0.78125 | 83.205 |
| 0.7819444444444444 | 83.205 |
| 0.782638888888889 | 87.692 |
| 0.7833333333333333 | 87.692 |
| 0.7840277777777778 | 83.205 |
| 0.7847222222222222 | 83.205 |
| 0.7854166666666668 | 87.692 |
| 0.7861111111111111 | 87.692 |
| 0.7868055555555555 | 87.692 |
| 0.7875 | 87.692 |
| 0.7881944444444445 | 87.692 |
| 0.7888888888888889 | 87.692 |
| 0.7895833333333333 | 87.692 |
| 0.7902777777777777 | 83.205 |
| 0.7909722222222223 | 83.205 |
| 0.7916666666666666 | 78.722 |
| 0.7923611111111111 | 78.722 |
| 0.7930555555555556 | 74.246 |
| 0.7937500000000001 | 74.246 |
| 0.7944444444444444 | 74.246 |
| 0.7951388888888888 | 74.246 |
| 0.7958333333333334 | 69.775 |
| 0.7965277777777778 | 65.31 |
| 0.7972222222222222 | 65.31 |
| 0.7979166666666666 | 65.31 |
| 0.7986111111111112 | 65.31 |
| 0.7993055555555556 | 60.85 |
| 0.7999999999999999 | 60.85 |
| 0.8006944444444444 | 60.85 |
| 0.8013888888888889 | 60.85 |
| 0.8020833333333334 | 60.85 |
| 0.8027777777777777 | 60.85 |
| 0.8034722222222223 | 60.85 |
| 0.8041666666666667 | 60.85 |
| 0.8048611111111111 | 60.85 |
| 0.8055555555555555 | 56.398 |
| 0.80625 | 56.398 |
| 0.8069444444444445 | 56.398 |
| 0.8076388888888889 | 51.951 |
| 0.8083333333333332 | 51.951 |
| 0.8090277777777778 | 47.511 |
| 0.8097222222222222 | 47.511 |
| 0.8104166666666667 | 47.511 |
| 0.811111111111111 | 43.079 |
| 0.8118055555555556 | 43.079 |
| 0.8125 | 43.079 |
| 0.8131944444444444 | 38.653 |
| 0.813888888888889 | 38.653 |
| 0.8145833333333333 | 38.653 |
| 0.8152777777777778 | 38.653 |
| 0.8159722222222222 | 38.653 |
| 0.8166666666666668 | 34.234 |
| 0.8173611111111111 | 34.234 |
| 0.8180555555555555 | 34.234 |
| 0.81875 | 34.234 |
| 0.8194444444444445 | 34.234 |
| 0.8201388888888889 | 29.823 |
| 0.8208333333333333 | 29.823 |
| 0.8215277777777777 | 29.823 |
| 0.8222222222222223 | 29.823 |
| 0.8229166666666666 | 29.823 |
| 0.8236111111111111 | 25.419 |
| 0.8243055555555556 | 25.419 |
| 0.8250000000000001 | 25.419 |
| 0.8256944444444444 | 25.419 |
| 0.8263888888888888 | 21.024 |
| 0.8270833333333334 | 21.024 |
| 0.8277777777777778 | 21.024 |
| 0.8284722222222222 | 21.024 |
| 0.8291666666666666 | 16.636 |
| 0.8298611111111112 | 16.636 |
| 0.8305555555555556 | 16.636 |
| 0.8312499999999999 | 12.257 |
| 0.8319444444444444 | 12.257 |
| 0.8326388888888889 | 12.257 |
| 0.8333333333333334 | 12.257 |
| 0.8340277777777777 | 12.257 |
| 0.8347222222222223 | 12.257 |
| 0.8354166666666667 | 7.887 |
| 0.8361111111111111 | 7.887 |
| 0.8368055555555555 | 7.887 |
| 0.8375 | 7.887 |
| 0.8381944444444445 | 7.887 |
| 0.8388888888888889 | 3.525 |
| 0.8395833333333332 | 3.525 |
| 0.8402777777777778 | 3.525 |
| 0.8409722222222222 | 3.525 |
| 0.8416666666666667 | 3.525 |
| 0.842361111111111 | 3.525 |
| 0.8430555555555556 | 3.525 |
| 0.84375 | 0 |
| 0.8444444444444444 | 3.525 |
| 0.845138888888889 | 0 |
| 0.8458333333333333 | 0 |
| 0.8465277777777778 | 0 |
| 0.8472222222222222 | 0 |
| 0.8479166666666668 | 0 |
| 0.8486111111111111 | 0 |
| 0.8493055555555555 | 0 |
| 0.85 | 0 |
| 0.8506944444444445 | 0 |
| 0.8513888888888889 | 0 |
| 0.8520833333333333 | 0 |
| 0.8527777777777777 | 0 |
| 0.8534722222222223 | 0 |
| 0.8541666666666666 | 0 |
| 0.8548611111111111 | 0 |
| 0.8555555555555556 | 0 |
| 0.8562500000000001 | 0 |
| 0.8569444444444444 | 0 |
| 0.8576388888888888 | 0 |
| 0.8583333333333334 | 0 |
| 0.8590277777777778 | 0 |
| 0.8597222222222222 | 0 |
| 0.8604166666666666 | 0 |
| 0.8611111111111112 | 0 |
| 0.8618055555555556 | 0 |
| 0.8624999999999999 | 0 |
| 0.8631944444444444 | 0 |
| 0.8638888888888889 | 0 |
| 0.8645833333333334 | 0 |
| 0.8652777777777777 | 0 |
| 0.8659722222222223 | 0 |
| 0.8666666666666667 | 0 |
| 0.8673611111111111 | 0 |
| 0.8680555555555555 | 0 |
| 0.86875 | 0 |
| 0.8694444444444445 | 0 |
| 0.8701388888888889 | 0 |
| 0.8708333333333332 | 0 |
| 0.8715277777777778 | 0 |
| 0.8722222222222222 | 0 |
| 0.8729166666666667 | 0 |
| 0.873611111111111 | 0 |
| 0.8743055555555556 | 0 |
| 0.875 | 0 |
| 0.8756944444444444 | 0 |
| 0.876388888888889 | 0 |
| 0.8770833333333333 | 0 |
| 0.8777777777777778 | 0 |
| 0.8784722222222222 | 0 |
| 0.8791666666666668 | 0 |
| 0.8798611111111111 | 0 |
| 0.8805555555555555 | 0 |
| 0.88125 | 0 |
| 0.8819444444444445 | 0 |
| 0.8826388888888889 | 0 |
| 0.8833333333333333 | 0 |
| 0.8840277777777777 | 0 |
| 0.8847222222222223 | 0 |
| 0.8854166666666666 | 0 |
| 0.8861111111111111 | 0 |
| 0.8868055555555556 | 0 |
| 0.8875000000000001 | 0 |
| 0.8881944444444444 | 0 |
| 0.8888888888888888 | 0 |
| 0.8895833333333334 | 0 |
| 0.8902777777777778 | 0 |
| 0.8909722222222222 | 0 |
| 0.8916666666666666 | 0 |
| 0.8923611111111112 | 0 |
| 0.8930555555555556 | 0 |
| 0.8937499999999999 | 0 |
| 0.8944444444444444 | 0 |
| 0.8951388888888889 | 0 |
| 0.8958333333333334 | 0 |
| 0.8965277777777777 | 0 |
| 0.8972222222222223 | 0 |
| 0.8979166666666667 | 0 |
| 0.8986111111111111 | 0 |
| 0.8993055555555555 | 0 |
| 0.9 | 0 |
| 0.9006944444444445 | 0 |
| 0.9013888888888889 | 0 |
| 0.9020833333333332 | 0 |
| 0.9027777777777778 | 0 |
| 0.9034722222222222 | 0 |
| 0.9041666666666667 | 0 |
| 0.904861111111111 | 0 |
| 0.9055555555555556 | 0 |
| 0.90625 | 0 |
| 0.9069444444444444 | 0 |
| 0.907638888888889 | 0 |
| 0.9083333333333333 | 0 |
| 0.9090277777777778 | 0 |
| 0.9097222222222222 | 0 |
| 0.9104166666666668 | 0 |
| 0.9111111111111111 | 0 |
| 0.9118055555555555 | 0 |
| 0.9125 | 0 |
| 0.9131944444444445 | 0 |
| 0.9138888888888889 | 0 |
| 0.9145833333333333 | 0 |
| 0.9152777777777777 | 0 |
| 0.9159722222222223 | 0 |
| 0.9166666666666666 | 0 |
| 0.9173611111111111 | 0 |
| 0.9180555555555556 | 0 |
| 0.9187500000000001 | 0 |
| 0.9194444444444444 | 0 |
| 0.9201388888888888 | 0 |
| 0.9208333333333334 | 0 |
| 0.9215277777777778 | 0 |
| 0.9222222222222222 | 0 |
| 0.9229166666666666 | 0 |
| 0.9236111111111112 | 0 |
| 0.9243055555555556 | 0 |
| 0.9249999999999999 | 0 |
| 0.9256944444444444 | 0 |
| 0.9263888888888889 | 0 |
| 0.9270833333333334 | 0 |
| 0.9277777777777777 | 0 |
| 0.9284722222222223 | 0 |
| 0.9291666666666667 | 0 |
| 0.9298611111111111 | 0 |
| 0.9305555555555555 | 0 |
| 0.93125 | 0 |
| 0.9319444444444445 | 0 |
| 0.9326388888888889 | 0 |
| 0.9333333333333332 | 0 |
| 0.9340277777777778 | 0 |
| 0.9347222222222222 | 0 |
| 0.9354166666666667 | 0 |
| 0.936111111111111 | 0 |
| 0.9368055555555556 | 0 |
| 0.9375 | 0 |
| 0.9381944444444444 | 0 |
| 0.938888888888889 | 0 |
| 0.9395833333333333 | 0 |
| 0.9402777777777778 | 0 |
| 0.9409722222222222 | 0 |
| 0.9416666666666668 | 0 |
| 0.9423611111111111 | 0 |
| 0.9430555555555555 | 0 |
| 0.94375 | 0 |
| 0.9444444444444445 | 0 |
| 0.9451388888888889 | 0 |
| 0.9458333333333333 | 0 |
| 0.9465277777777777 | 0 |
| 0.9472222222222223 | 0 |
| 0.9479166666666666 | 0 |
| 0.9486111111111111 | 0 |
| 0.9493055555555556 | 0 |
| 0.9500000000000001 | 0 |
| 0.9506944444444444 | 0 |
| 0.9513888888888888 | 0 |
| 0.9520833333333334 | 0 |
| 0.9527777777777778 | 0 |
| 0.9534722222222222 | 0 |
| 0.9541666666666666 | 0 |
| 0.9548611111111112 | 0 |
| 0.9555555555555556 | 0 |
| 0.9562499999999999 | 0 |
| 0.9569444444444444 | 0 |
| 0.9576388888888889 | 0 |
| 0.9583333333333334 | 0 |
| 0.9590277777777777 | 0 |
| 0.9597222222222223 | 0 |
| 0.9604166666666667 | 0 |
| 0.9611111111111111 | 0 |
| 0.9618055555555555 | 0 |
| 0.9625 | 0 |
| 0.9631944444444445 | 0 |
| 0.9638888888888889 | 0 |
| 0.9645833333333332 | 0 |
| 0.9652777777777778 | 0 |
| 0.9659722222222222 | 0 |
| 0.9666666666666667 | 0 |
| 0.967361111111111 | 0 |
| 0.9680555555555556 | 0 |
| 0.96875 | 0 |
| 0.9694444444444444 | 0 |
| 0.970138888888889 | 0 |
| 0.9708333333333333 | 0 |
| 0.9715277777777778 | 0 |
| 0.9722222222222222 | 0 |
| 0.9729166666666668 | 0 |
| 0.9736111111111111 | 0 |
| 0.9743055555555555 | 0 |
| 0.975 | 0 |
| 0.9756944444444445 | 0 |
| 0.9763888888888889 | 0 |
| 0.9770833333333333 | 0 |
| 0.9777777777777777 | 0 |
| 0.9784722222222223 | 0 |
| 0.9791666666666666 | 0 |
| 0.9798611111111111 | 0 |
| 0.9805555555555556 | 0 |
| 0.9812500000000001 | 0 |
| 0.9819444444444444 | 0 |
| 0.9826388888888888 | 0 |
| 0.9833333333333334 | 0 |
| 0.9840277777777778 | 0 |
| 0.9847222222222222 | 0 |
| 0.9854166666666666 | 0 |
| 0.9861111111111112 | 0 |
| 0.9868055555555556 | 0 |
| 0.9874999999999999 | 0 |
| 0.9881944444444444 | 0 |
| 0.9888888888888889 | 0 |
| 0.9895833333333334 | 0 |
| 0.9902777777777777 | 0 |
| 0.9909722222222223 | 0 |
| 0.9916666666666667 | 0 |
| 0.9923611111111111 | 0 |
| 0.9930555555555555 | 0 |
| 0.99375 | 0 |
| 0.9944444444444445 | 0 |
| 0.9951388888888889 | 0 |
| 0.9958333333333332 | 0 |
| 0.9965277777777778 | 0 |
| 0.9972222222222222 | 0 |
| 0.9979166666666667 | 0 |
| 0.998611111111111 | 0 |
| 0.9993055555555556 | 0 |